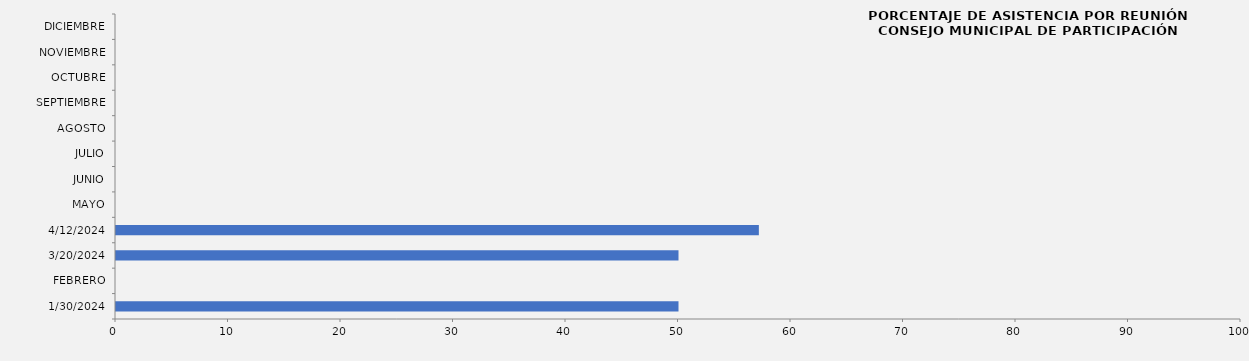
| Category | Series 0 |
|---|---|
| 30/01/2024 | 50 |
| FEBRERO | 0 |
| 20/03/2024 | 50 |
| 12/04/2024 | 57.143 |
| MAYO | 0 |
| JUNIO | 0 |
| JULIO | 0 |
| AGOSTO | 0 |
| SEPTIEMBRE | 0 |
| OCTUBRE | 0 |
| NOVIEMBRE | 0 |
| DICIEMBRE | 0 |